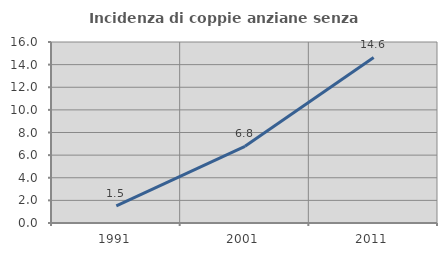
| Category | Incidenza di coppie anziane senza figli  |
|---|---|
| 1991.0 | 1.515 |
| 2001.0 | 6.78 |
| 2011.0 | 14.634 |